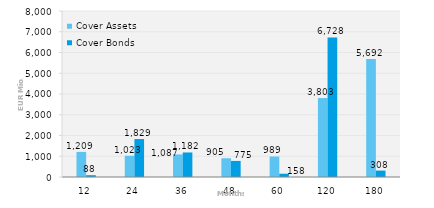
| Category | Cover Assets | Cover Bonds |
|---|---|---|
| 12.0 | 1209.494 | 87.509 |
| 24.0 | 1022.704 | 1828.897 |
| 36.0 | 1087.476 | 1181.653 |
| 48.0 | 904.765 | 775 |
| 60.0 | 989.035 | 157.5 |
| 120.0 | 3803.354 | 6728.38 |
| 180.0 | 5692.325 | 308.489 |